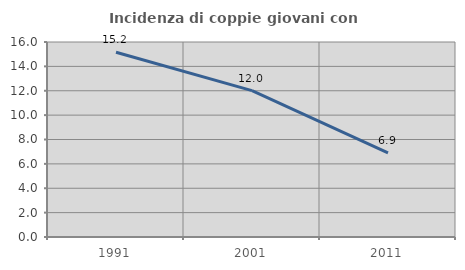
| Category | Incidenza di coppie giovani con figli |
|---|---|
| 1991.0 | 15.162 |
| 2001.0 | 12.006 |
| 2011.0 | 6.904 |